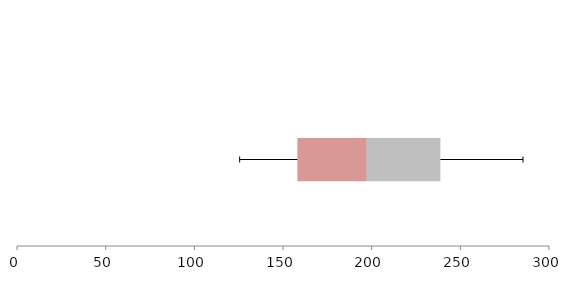
| Category | Series 1 | Series 2 | Series 3 |
|---|---|---|---|
| 0 | 158.133 | 39.142 | 41.473 |